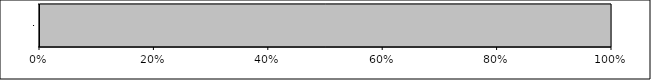
| Category | Series 0 | Series 1 | Series 2 | Series 3 |
|---|---|---|---|---|
| 0 | 0 | 0 | 0 | 4 |